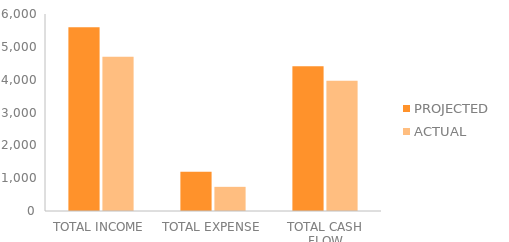
| Category | PROJECTED | ACTUAL |
|---|---|---|
| 0 | 5600 | 4700 |
| 1 | 1195 | 736 |
| 2 | 4405 | 3964 |